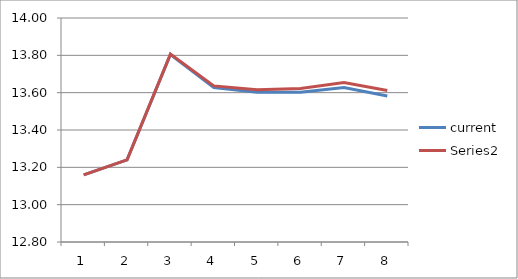
| Category | current | Series 1 |
|---|---|---|
| 0 | 13.159 | 13.159 |
| 1 | 13.24 | 13.24 |
| 2 | 13.805 | 13.807 |
| 3 | 13.627 | 13.636 |
| 4 | 13.603 | 13.616 |
| 5 | 13.602 | 13.622 |
| 6 | 13.627 | 13.655 |
| 7 | 13.582 | 13.612 |